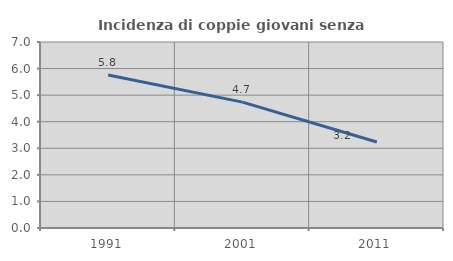
| Category | Incidenza di coppie giovani senza figli |
|---|---|
| 1991.0 | 5.76 |
| 2001.0 | 4.738 |
| 2011.0 | 3.235 |